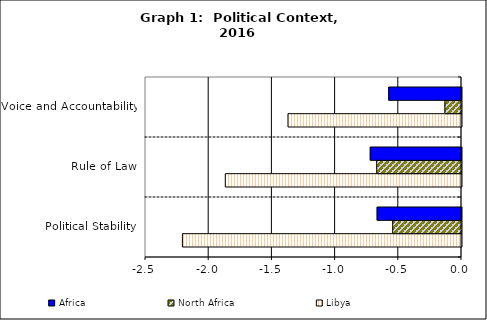
| Category | Libya | North Africa | Africa |
|---|---|---|---|
| Political Stability | -2.208 | -0.544 | -0.667 |
| Rule of Law | -1.869 | -0.671 | -0.722 |
| Voice and Accountability | -1.373 | -0.131 | -0.576 |